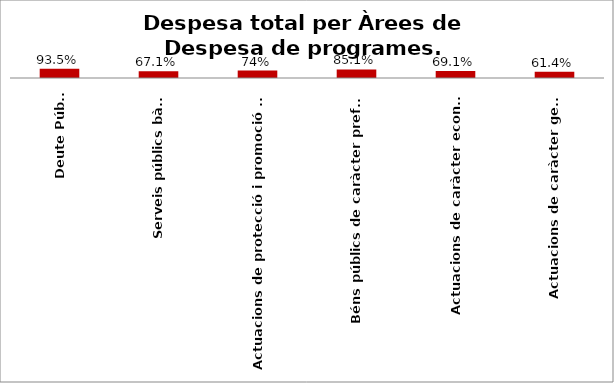
| Category | Series 0 |
|---|---|
| Deute Públic | 0.935 |
| Serveis públics bàsics | 0.671 |
| Actuacions de protecció i promoció social | 0.741 |
| Béns públics de caràcter preferent | 0.851 |
| Actuacions de caràcter econòmic | 0.691 |
| Actuacions de caràcter general | 0.614 |